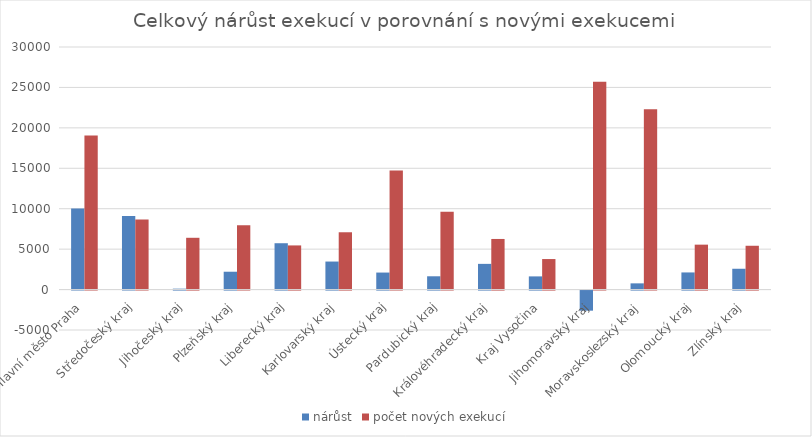
| Category | nárůst | počet nových exekucí |
|---|---|---|
| Hlavní město Praha | 10038 | 19050 |
| Středočeský kraj | 9084 | 8659 |
| Jihočeský kraj | 111 | 6404 |
| Plzeňský kraj | 2207 | 7943 |
| Liberecký kraj | 5732 | 5460 |
| Karlovarský kraj | 3466 | 7088 |
| Ústecký kraj | 2104 | 14740 |
| Pardubický kraj | 1644 | 9632 |
| Královéhradecký kraj | 3179 | 6259 |
| Kraj Vysočina | 1630 | 3775 |
| Jihomoravský kraj | -2485 | 25695 |
| Moravskoslezský kraj | 769 | 22300 |
| Olomoucký kraj | 2119 | 5556 |
| Zlínský kraj | 2574 | 5418 |